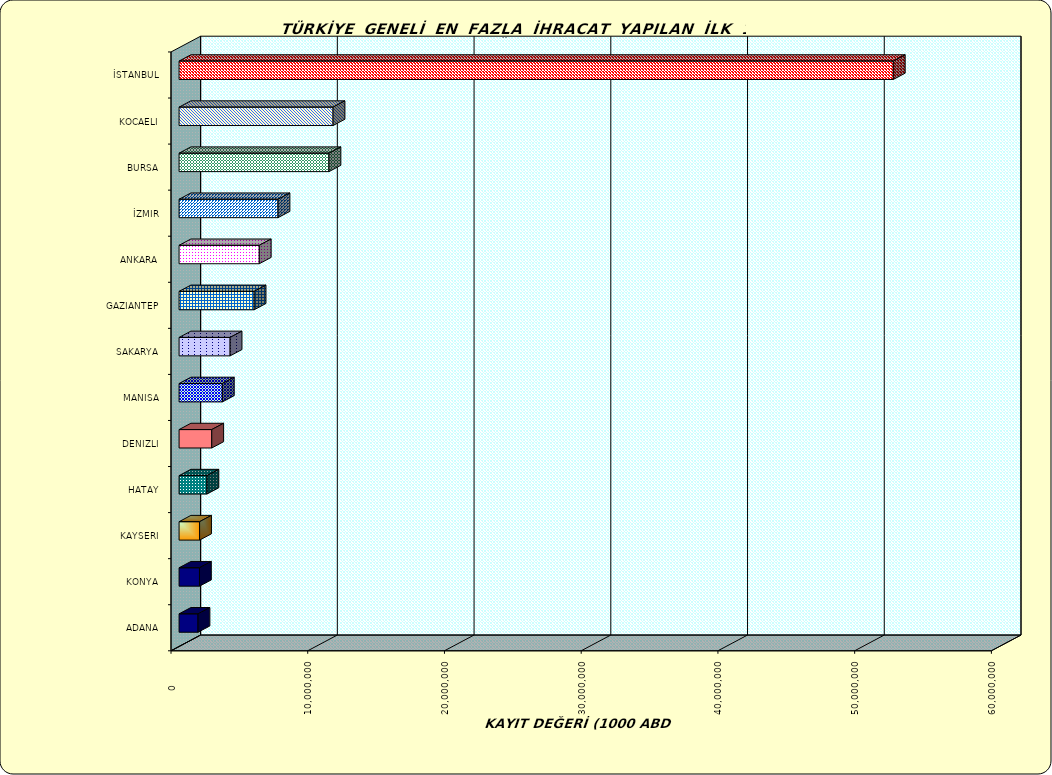
| Category | Series 0 |
|---|---|
| İSTANBUL | 52236908.585 |
| KOCAELI | 11262316.286 |
| BURSA | 10964299.902 |
| İZMIR | 7235981.69 |
| ANKARA | 5866763.694 |
| GAZIANTEP | 5487914.025 |
| SAKARYA | 3732873.817 |
| MANISA | 3165792.921 |
| DENIZLI | 2389806.156 |
| HATAY | 2038393.498 |
| KAYSERI | 1501163.358 |
| KONYA | 1491316.841 |
| ADANA | 1385133.053 |